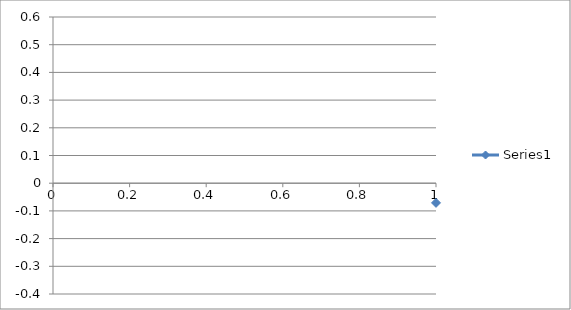
| Category | Series 0 |
|---|---|
| 0 | -0.071 |
| 1 | -0.069 |
| 2 | -0.07 |
| 3 | -0.061 |
| 4 | -0.047 |
| 5 | -0.045 |
| 6 | -0.048 |
| 7 | -0.048 |
| 8 | -0.054 |
| 9 | -0.048 |
| 10 | -0.042 |
| 11 | -0.028 |
| 12 | -0.036 |
| 13 | -0.04 |
| 14 | -0.041 |
| 15 | -0.036 |
| 16 | -0.043 |
| 17 | -0.038 |
| 18 | -0.021 |
| 19 | -0.019 |
| 20 | -0.014 |
| 21 | -0.027 |
| 22 | -0.006 |
| 23 | -0.006 |
| 24 | 0.01 |
| 25 | 0.014 |
| 26 | 0.003 |
| 27 | 0.01 |
| 28 | 0.034 |
| 29 | 0.029 |
| 30 | 0.007 |
| 31 | 0.003 |
| 32 | 0.011 |
| 33 | 0.012 |
| 34 | 0.024 |
| 35 | 0.024 |
| 36 | 0.025 |
| 37 | 0.014 |
| 38 | -0.003 |
| 39 | -0.001 |
| 40 | -0.011 |
| 41 | -0.015 |
| 42 | -0.014 |
| 43 | -0.021 |
| 44 | -0.025 |
| 45 | -0.03 |
| 46 | -0.026 |
| 47 | -0.058 |
| 48 | -0.086 |
| 49 | -0.102 |
| 50 | -0.105 |
| 51 | -0.118 |
| 52 | -0.133 |
| 53 | -0.158 |
| 54 | -0.169 |
| 55 | -0.176 |
| 56 | -0.206 |
| 57 | -0.228 |
| 58 | -0.235 |
| 59 | -0.232 |
| 60 | -0.259 |
| 61 | -0.272 |
| 62 | -0.285 |
| 63 | -0.292 |
| 64 | -0.292 |
| 65 | -0.289 |
| 66 | -0.291 |
| 67 | -0.291 |
| 68 | -0.284 |
| 69 | -0.279 |
| 70 | -0.257 |
| 71 | -0.243 |
| 72 | -0.226 |
| 73 | -0.19 |
| 74 | -0.155 |
| 75 | -0.123 |
| 76 | -0.104 |
| 77 | -0.073 |
| 78 | -0.025 |
| 79 | 0.012 |
| 80 | 0.045 |
| 81 | 0.073 |
| 82 | 0.12 |
| 83 | 0.169 |
| 84 | 0.204 |
| 85 | 0.228 |
| 86 | 0.268 |
| 87 | 0.309 |
| 88 | 0.352 |
| 89 | 0.358 |
| 90 | 0.385 |
| 91 | 0.409 |
| 92 | 0.426 |
| 93 | 0.442 |
| 94 | 0.453 |
| 95 | 0.46 |
| 96 | 0.456 |
| 97 | 0.463 |
| 98 | 0.466 |
| 99 | 0.452 |
| 100 | 0.444 |
| 101 | 0.437 |
| 102 | 0.435 |
| 103 | 0.406 |
| 104 | 0.378 |
| 105 | 0.37 |
| 106 | 0.35 |
| 107 | 0.326 |
| 108 | 0.304 |
| 109 | 0.27 |
| 110 | 0.248 |
| 111 | 0.251 |
| 112 | 0.221 |
| 113 | 0.218 |
| 114 | 0.21 |
| 115 | 0.195 |
| 116 | 0.189 |
| 117 | 0.162 |
| 118 | 0.162 |
| 119 | 0.164 |
| 120 | 0.155 |
| 121 | 0.148 |
| 122 | 0.139 |
| 123 | 0.14 |
| 124 | 0.138 |
| 125 | 0.134 |
| 126 | 0.117 |
| 127 | 0.116 |
| 128 | 0.135 |
| 129 | 0.149 |
| 130 | 0.131 |
| 131 | 0.141 |
| 132 | 0.136 |
| 133 | 0.144 |
| 134 | 0.143 |
| 135 | 0.145 |
| 136 | 0.156 |
| 137 | 0.159 |
| 138 | 0.15 |
| 139 | 0.152 |
| 140 | 0.176 |
| 141 | 0.178 |
| 142 | 0.165 |
| 143 | 0.179 |
| 144 | 0.176 |
| 145 | 0.181 |
| 146 | 0.183 |
| 147 | 0.193 |
| 148 | 0.2 |
| 149 | 0.209 |
| 150 | 0.203 |
| 151 | 0.198 |
| 152 | 0.213 |
| 153 | 0.207 |
| 154 | 0.225 |
| 155 | 0.212 |
| 156 | 0.205 |
| 157 | 0.215 |
| 158 | 0.225 |
| 159 | 0.239 |
| 160 | 0.238 |